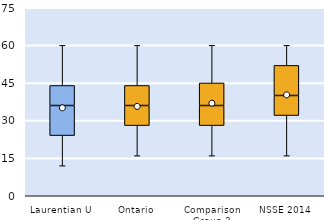
| Category | 25th | 50th | 75th |
|---|---|---|---|
| Laurentian U | 24 | 12 | 8 |
| Ontario | 28 | 8 | 8 |
| Comparison Group 2 | 28 | 8 | 9 |
| NSSE 2014 | 32 | 8 | 12 |